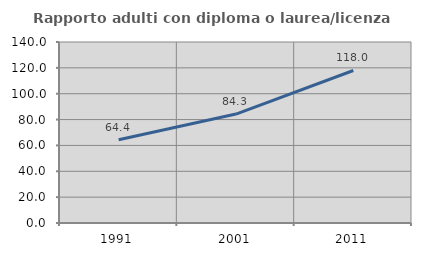
| Category | Rapporto adulti con diploma o laurea/licenza media  |
|---|---|
| 1991.0 | 64.398 |
| 2001.0 | 84.276 |
| 2011.0 | 117.966 |